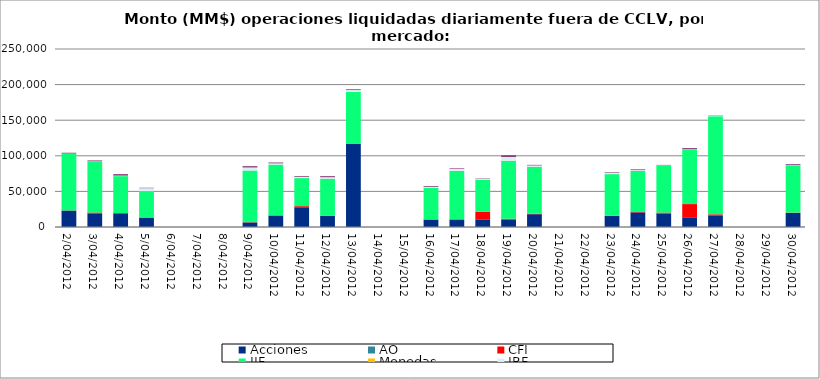
| Category | Acciones | AO | CFI | IIF | Monedas | IRF | Simultáneas |
|---|---|---|---|---|---|---|---|
| 2012-04-02 | 23094.554 | 0.303 | 215.113 | 79532.665 | 20.45 | 406.931 | 987.885 |
| 2012-04-03 | 19160.75 | 0.298 | 1197.948 | 71234.763 | 16.576 | 607.948 | 1199.497 |
| 2012-04-04 | 18432.276 | 0.026 | 1175.218 | 51873.197 | 1.042 | 815.217 | 1836.289 |
| 2012-04-05 | 12917.045 | 0.039 | 552.273 | 36884.288 | 2.86 | 4181.552 | 537.052 |
| 2012-04-09 | 6413.694 | 0.029 | 377.279 | 72550.173 | 0 | 4332.181 | 1647.611 |
| 2012-04-10 | 15740.099 | 0.026 | 748.977 | 71161.895 | 6.001 | 1795.76 | 1048.313 |
| 2012-04-11 | 27715.612 | 0.035 | 1555.816 | 39430.341 | 27.762 | 1455.17 | 991.937 |
| 2012-04-12 | 15805.536 | 0.139 | 184.846 | 51877.265 | 2.06 | 2101.733 | 1313.796 |
| 2012-04-13 | 116732.871 | 0.088 | 668.419 | 72448.637 | 1.028 | 2511.403 | 923.879 |
| 2012-04-16 | 10478.454 | 0.01 | 200.554 | 44480.135 | 1 | 1182.806 | 984.507 |
| 2012-04-17 | 10338.713 | 0 | 559.548 | 67952.422 | 12.961 | 2627.94 | 747.136 |
| 2012-04-18 | 10735.662 | 0.341 | 10577.37 | 45265.405 | 4.545 | 1769.198 | 419.392 |
| 2012-04-19 | 10470.266 | 0.018 | 1128.388 | 81455.908 | 1.785 | 5491.972 | 1972.51 |
| 2012-04-20 | 17981.181 | 0 | 572.616 | 66071.129 | 2.04 | 1909.741 | 721.758 |
| 2012-04-23 | 15758.788 | 0 | 118.456 | 58394.744 | 10.1 | 2267.13 | 688.669 |
| 2012-04-24 | 20546.79 | 1.653 | 1155.39 | 56937.149 | 1 | 1315.717 | 890.456 |
| 2012-04-25 | 18818.165 | 0.673 | 1489.519 | 66054.989 | 4.5 | 362.483 | 468.1 |
| 2012-04-26 | 13648.532 | 0.212 | 18556.175 | 77146.352 | 14.41 | 448.271 | 1151.282 |
| 2012-04-27 | 15707.679 | 0.683 | 2059.505 | 137852.453 | 0.99 | 743.222 | 366.905 |
| 2012-04-30 | 19728.237 | 0.422 | 505.844 | 66276.439 | 0 | 402.975 | 1173.004 |